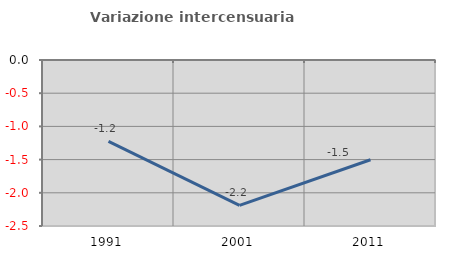
| Category | Variazione intercensuaria annua |
|---|---|
| 1991.0 | -1.225 |
| 2001.0 | -2.19 |
| 2011.0 | -1.503 |